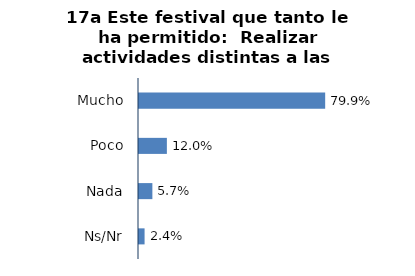
| Category | Series 0 |
|---|---|
| Mucho | 0.799 |
| Poco | 0.12 |
| Nada | 0.057 |
| Ns/Nr | 0.024 |